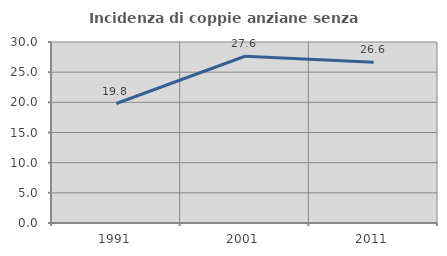
| Category | Incidenza di coppie anziane senza figli  |
|---|---|
| 1991.0 | 19.802 |
| 2001.0 | 27.638 |
| 2011.0 | 26.63 |